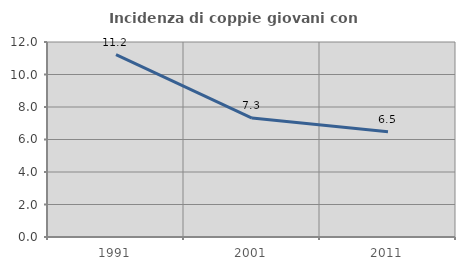
| Category | Incidenza di coppie giovani con figli |
|---|---|
| 1991.0 | 11.218 |
| 2001.0 | 7.317 |
| 2011.0 | 6.475 |